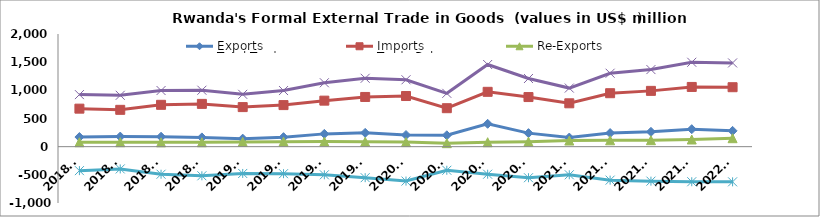
| Category | Exports | Imports | Re-Exports | Total Trade | Trade Balance |
|---|---|---|---|---|---|
| 2018Q1 | 170.799 | 674.777 | 78.5 | 924.075 | -425.479 |
| 2018Q2 | 179.196 | 653.691 | 79.205 | 912.093 | -395.289 |
| 2018Q3 | 176.56 | 742.86 | 77.118 | 996.538 | -489.182 |
| 2018Q4 | 164.223 | 759.496 | 78.239 | 1001.958 | -517.034 |
| 2019Q1 | 142.226 | 702.457 | 84.537 | 929.22 | -475.694 |
| 2019Q2 | 168.991 | 737.888 | 89.17 | 996.048 | -479.727 |
| 2019Q3 | 226.991 | 816.871 | 90.481 | 1134.343 | -499.399 |
| 2019Q4 | 244.881 | 882.342 | 86.987 | 1214.21 | -550.474 |
| 2020Q1 | 206.757 | 898.996 | 81.633 | 1187.386 | -610.606 |
| 2020Q2 | 201.77 | 682.838 | 62.103 | 946.711 | -418.965 |
| 2020Q3 | 405.953 | 973.662 | 78.856 | 1458.471 | -488.853 |
| 2020Q4 | 240.244 | 880.636 | 89.074 | 1209.954 | -551.318 |
| 2021Q1 | 161.83 | 769.77 | 108.59 | 1040.19 | -499.35 |
| 2021Q2 | 241.484 | 948.948 | 113.328 | 1303.761 | -594.135 |
| 2021Q3 | 263.416 | 990.421 | 114.805 | 1368.643 | -612.2 |
| 2021Q4 | 310.514 | 1060.28 | 127.194 | 1497.988 | -622.572 |
| 2022Q1 | 280.673 | 1055.385 | 150.457 | 1486.514 | -624.255 |